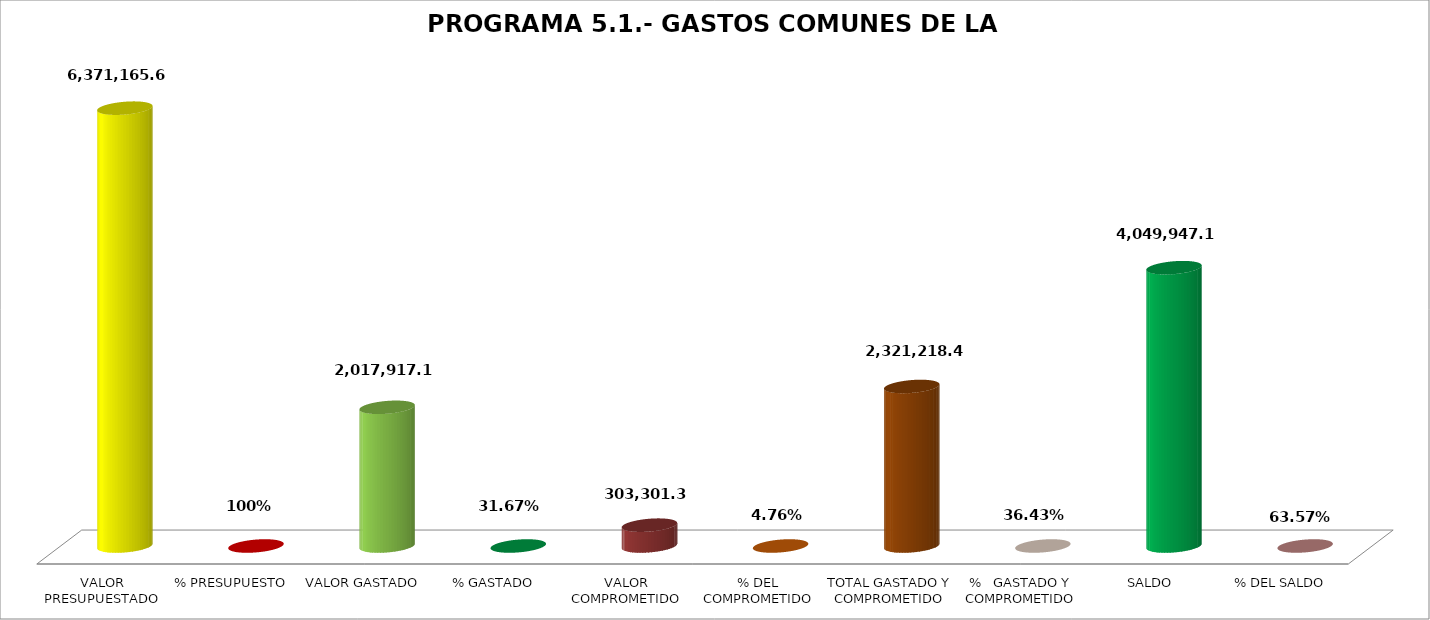
| Category | PROGRAMA 5.1.- GASTOS COMUNES DE LA ENTIDAD |
|---|---|
| VALOR PRESUPUESTADO | 6371165.67 |
| % PRESUPUESTO | 1 |
| VALOR GASTADO | 2017917.1 |
| % GASTADO | 0.317 |
| VALOR COMPROMETIDO | 303301.39 |
| % DEL COMPROMETIDO | 0.048 |
| TOTAL GASTADO Y COMPROMETIDO | 2321218.49 |
| %   GASTADO Y COMPROMETIDO | 0.364 |
| SALDO | 4049947.18 |
| % DEL SALDO | 0.636 |